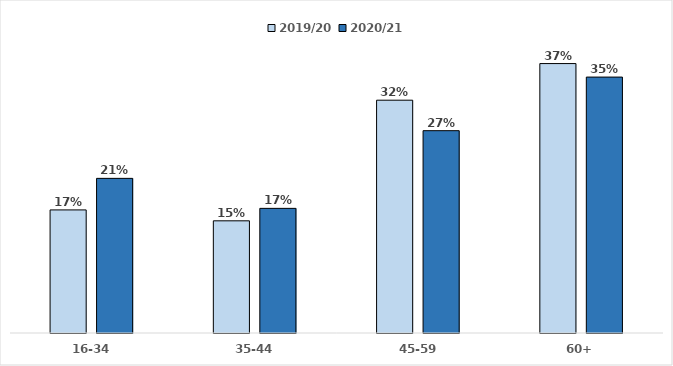
| Category | 2019/20 | 2020/21 |
|---|---|---|
| 16-34 | 0.167 | 0.21 |
| 35-44 | 0.152 | 0.169 |
| 45-59 | 0.316 | 0.274 |
| 60+ | 0.365 | 0.347 |